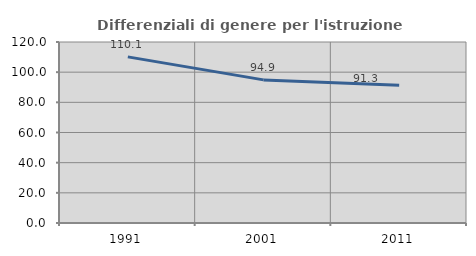
| Category | Differenziali di genere per l'istruzione superiore |
|---|---|
| 1991.0 | 110.126 |
| 2001.0 | 94.879 |
| 2011.0 | 91.285 |